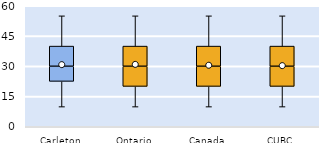
| Category | 25th | 50th | 75th |
|---|---|---|---|
| Carleton | 22.5 | 7.5 | 10 |
| Ontario | 20 | 10 | 10 |
| Canada | 20 | 10 | 10 |
| CUBC | 20 | 10 | 10 |